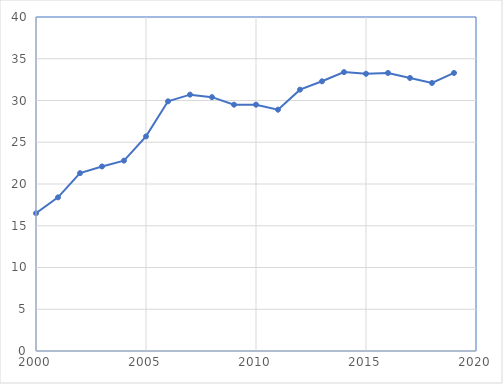
| Category | Series 0 |
|---|---|
| 2000.0 | 16.5 |
| 2001.0 | 18.4 |
| 2002.0 | 21.3 |
| 2003.0 | 22.1 |
| 2004.0 | 22.8 |
| 2005.0 | 25.7 |
| 2006.0 | 29.9 |
| 2007.0 | 30.7 |
| 2008.0 | 30.4 |
| 2009.0 | 29.5 |
| 2010.0 | 29.5 |
| 2011.0 | 28.9 |
| 2012.0 | 31.3 |
| 2013.0 | 32.3 |
| 2014.0 | 33.4 |
| 2015.0 | 33.2 |
| 2016.0 | 33.3 |
| 2017.0 | 32.7 |
| 2018.0 | 32.1 |
| 2019.0 | 33.3 |